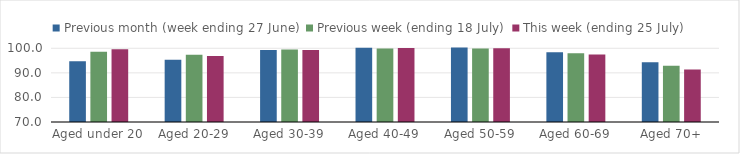
| Category | Previous month (week ending 27 June) | Previous week (ending 18 July) | This week (ending 25 July) |
|---|---|---|---|
| Aged under 20 | 94.766 | 98.605 | 99.64 |
| Aged 20-29 | 95.355 | 97.367 | 96.858 |
| Aged 30-39 | 99.29 | 99.507 | 99.335 |
| Aged 40-49 | 100.249 | 99.961 | 100.142 |
| Aged 50-59 | 100.346 | 99.915 | 100.016 |
| Aged 60-69 | 98.363 | 97.985 | 97.487 |
| Aged 70+ | 94.326 | 92.843 | 91.366 |